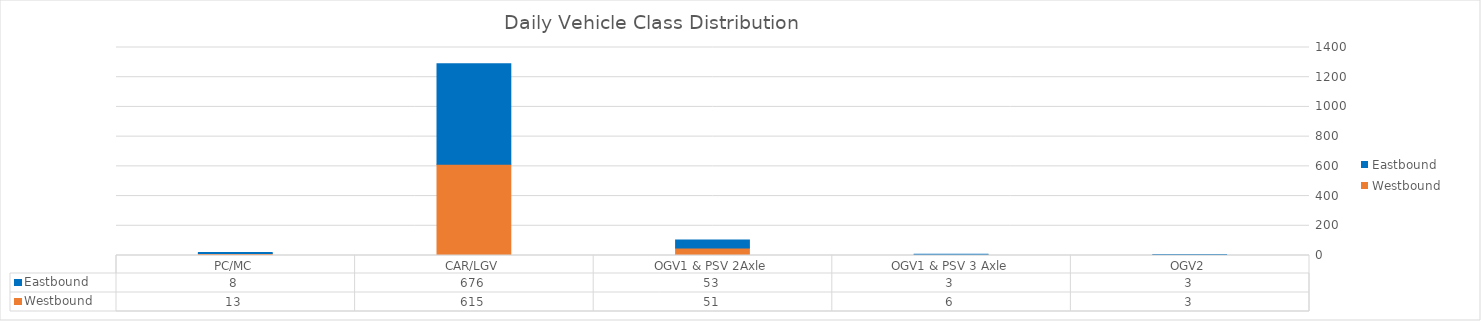
| Category | Westbound | Eastbound |
|---|---|---|
| PC/MC | 13 | 8 |
| CAR/LGV | 615 | 676 |
| OGV1 & PSV 2Axle | 51 | 53 |
| OGV1 & PSV 3 Axle | 6 | 3 |
| OGV2 | 3 | 3 |